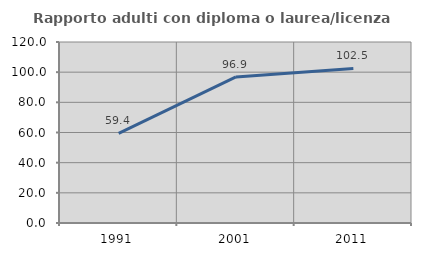
| Category | Rapporto adulti con diploma o laurea/licenza media  |
|---|---|
| 1991.0 | 59.366 |
| 2001.0 | 96.875 |
| 2011.0 | 102.503 |